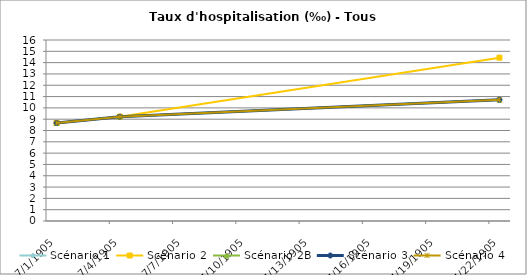
| Category | Scénario 1 | Scénario 2 | Scénario 2B | Scénario 3 | Scénario 4 |
|---|---|---|---|---|---|
| 2009.0 | 8.669 | 8.669 | 8.669 | 8.669 | 8.669 |
| 2012.0 | 9.224 | 9.224 | 9.224 | 9.224 | 9.224 |
| 2030.0 | 10.724 | 14.437 | 10.724 | 10.724 | 10.724 |